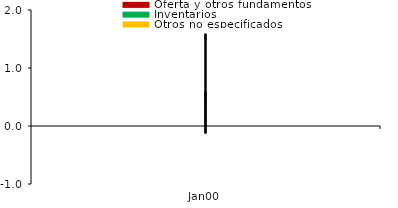
| Category | Oferta y otros fundamentos | Inventarios | Otros no especificados |
|---|---|---|---|
| 0 | 0.695 | 0 | -0.195 |
| 1900-01-01 | 1.062 | 0 | 0.529 |
| 1900-01-02 | 0.873 | 0.218 | 0.396 |
| 1900-01-03 | 0.886 | 0.218 | 0.261 |
| 1900-01-04 | 0.834 | 0.218 | -0.293 |
| 1900-01-05 | 0.643 | 0 | -0.441 |
| 1900-01-06 | 0.034 | 0 | 0.022 |
| 1900-01-07 | -0.417 | 0.033 | 0.256 |
| 1900-01-08 | -0.318 | 0.033 | 0.144 |
| 1900-01-09 | -0.027 | 0.762 | -0.143 |